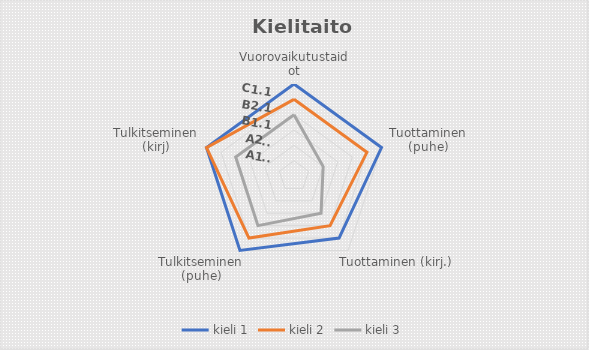
| Category | Series 3 |
|---|---|
| C1.1 | 0 |
| B2.1 | 0 |
| B1.1 | 0 |
| A2.1 | 0 |
| A1.1 | 0 |